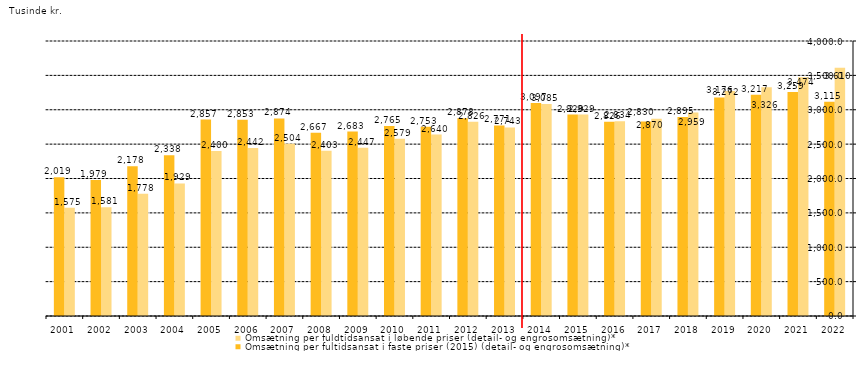
| Category | Omsætning per fuldtidsansat i løbende priser (detail- og engrosomsætning)* | Omsætning per fultidsansat i faste priser (2015) (detail- og engrosomsætning)* |
|---|---|---|
| 2022.0 | 3610.07 | 3114.815 |
| 2021.0 | 3474.381 | 3259.269 |
| 2020.0 | 3326.128 | 3216.758 |
| 2019.0 | 3271.661 | 3176.37 |
| 2018.0 | 2958.798 | 2895.106 |
| 2017.0 | 2869.836 | 2830.213 |
| 2016.0 | 2834.274 | 2825.797 |
| 2015.0 | 2929.271 | 2929.271 |
| 2014.0 | 3085.041 | 3097.431 |
| 2013.0 | 2743 | 2771 |
| 2012.0 | 2826 | 2878 |
| 2011.0 | 2640 | 2753 |
| 2010.0 | 2579 | 2765 |
| 2009.0 | 2447 | 2683 |
| 2008.0 | 2403 | 2667 |
| 2007.0 | 2504 | 2874 |
| 2006.0 | 2442 | 2853 |
| 2005.0 | 2400 | 2857 |
| 2004.0 | 1929 | 2338 |
| 2003.0 | 1778 | 2178 |
| 2002.0 | 1581 | 1979 |
| 2001.0 | 1575 | 2019 |